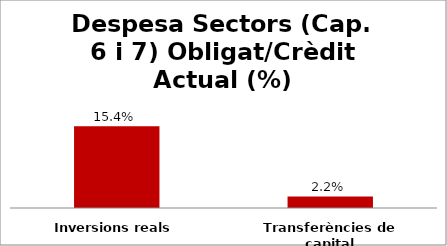
| Category | Series 0 |
|---|---|
| Inversions reals | 0.154 |
| Transferències de capital | 0.022 |